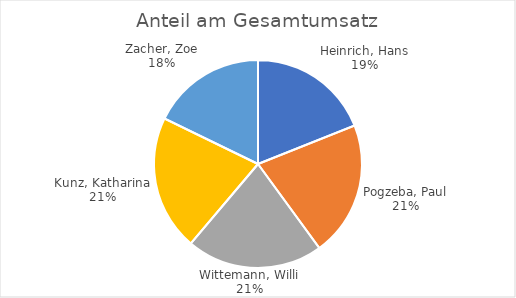
| Category | Series 0 |
|---|---|
| Heinrich, Hans | 18441352 |
| Pogzeba, Paul | 20414830 |
| Wittemann, Willi | 20617163 |
| Kunz, Katharina | 20458098 |
| Zacher, Zoe | 17302408 |